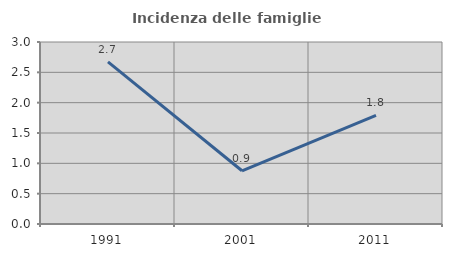
| Category | Incidenza delle famiglie numerose |
|---|---|
| 1991.0 | 2.674 |
| 2001.0 | 0.877 |
| 2011.0 | 1.792 |